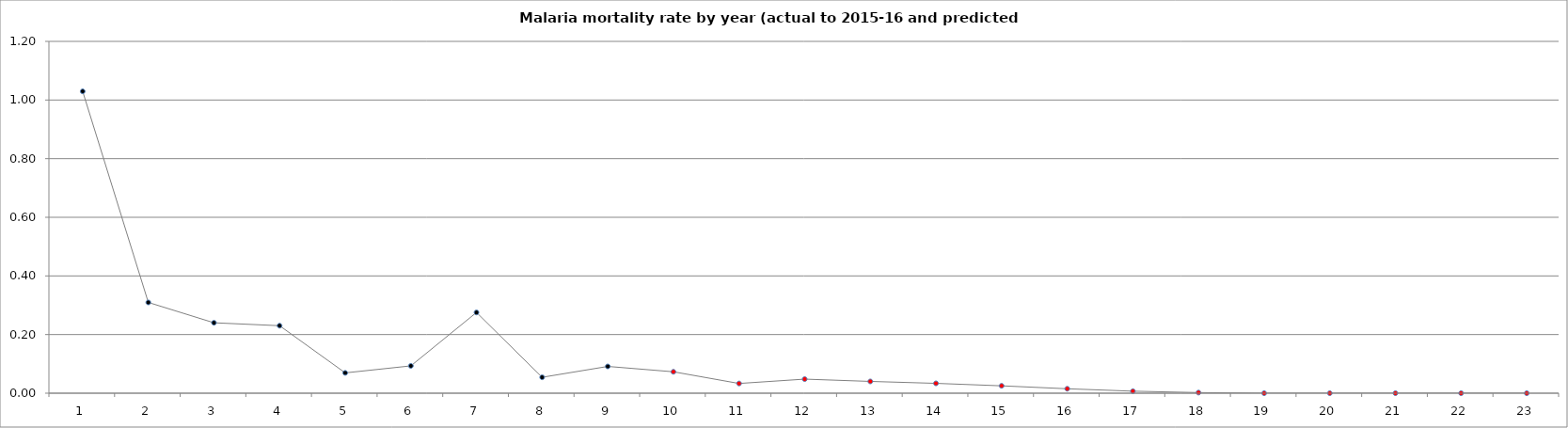
| Category | Series 0 |
|---|---|
| 0 | 1.03 |
| 1 | 0.31 |
| 2 | 0.24 |
| 3 | 0.23 |
| 4 | 0.069 |
| 5 | 0.093 |
| 6 | 0.275 |
| 7 | 0.054 |
| 8 | 0.091 |
| 9 | 0.073 |
| 10 | 0.033 |
| 11 | 0.048 |
| 12 | 0.04 |
| 13 | 0.034 |
| 14 | 0.025 |
| 15 | 0.015 |
| 16 | 0.007 |
| 17 | 0.002 |
| 18 | 0 |
| 19 | 0 |
| 20 | 0 |
| 21 | 0 |
| 22 | 0 |